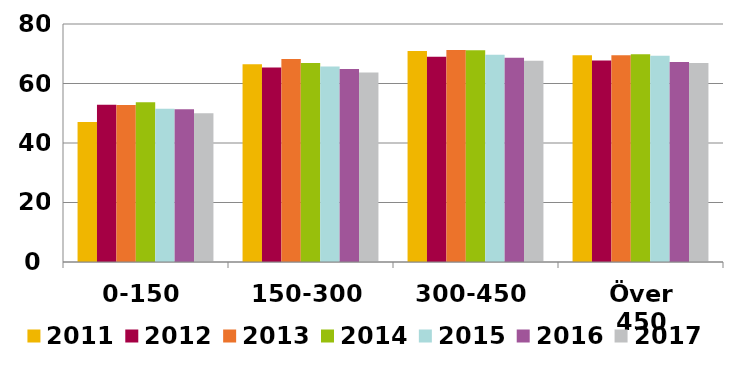
| Category | 2011 | 2012 | 2013 | 2014 | 2015 | 2016 | 2017 |
|---|---|---|---|---|---|---|---|
| 0-150 | 47.08 | 52.874 | 52.789 | 53.714 | 51.523 | 51.356 | 50.036 |
| 150-300 | 66.505 | 65.388 | 68.214 | 66.924 | 65.672 | 64.854 | 63.685 |
| 300-450 | 70.941 | 68.994 | 71.28 | 71.172 | 69.649 | 68.632 | 67.644 |
| Över 450 | 69.485 | 67.724 | 69.481 | 69.871 | 69.312 | 67.227 | 66.892 |